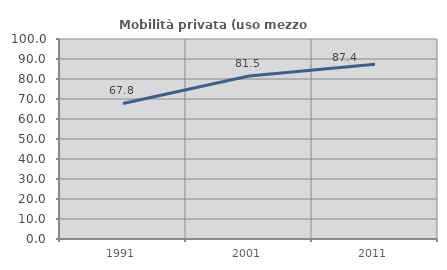
| Category | Mobilità privata (uso mezzo privato) |
|---|---|
| 1991.0 | 67.78 |
| 2001.0 | 81.513 |
| 2011.0 | 87.404 |